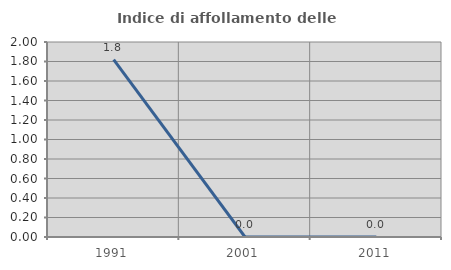
| Category | Indice di affollamento delle abitazioni  |
|---|---|
| 1991.0 | 1.818 |
| 2001.0 | 0 |
| 2011.0 | 0 |